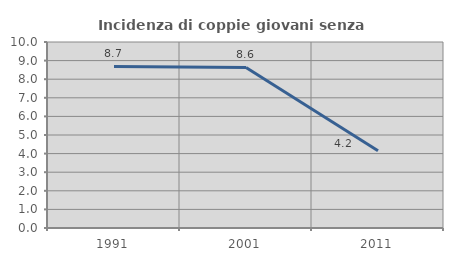
| Category | Incidenza di coppie giovani senza figli |
|---|---|
| 1991.0 | 8.687 |
| 2001.0 | 8.634 |
| 2011.0 | 4.155 |